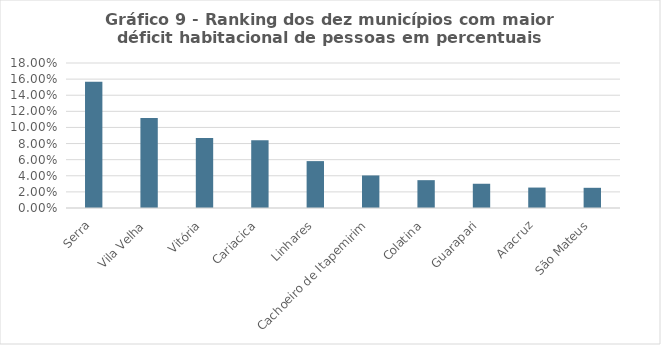
| Category | Series 0 |
|---|---|
| Serra | 0.157 |
| Vila Velha | 0.112 |
| Vitória | 0.087 |
| Cariacica | 0.084 |
| Linhares | 0.058 |
| Cachoeiro de Itapemirim | 0.04 |
| Colatina | 0.035 |
| Guarapari | 0.03 |
| Aracruz | 0.025 |
| São Mateus | 0.025 |